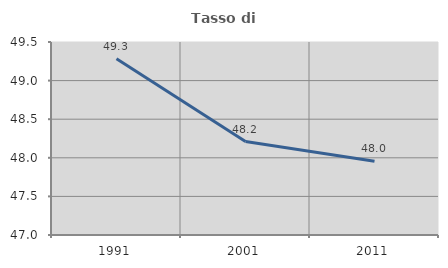
| Category | Tasso di occupazione   |
|---|---|
| 1991.0 | 49.282 |
| 2001.0 | 48.21 |
| 2011.0 | 47.955 |